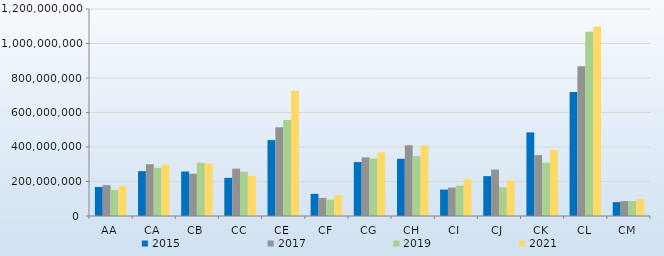
| Category | 2015 | 2017 | 2019 | 2021 |
|---|---|---|---|---|
| AA | 167978304 | 179261858 | 151408057 | 173776680 |
| CA | 260149386 | 299819346 | 279417683 | 297471659 |
| CB | 258106102 | 245004830 | 308661373 | 304556357 |
| CC | 221312980 | 274255013 | 256067782 | 233170064 |
| CE | 439972524 | 514952632 | 556244374 | 726088962 |
| CF | 128287479 | 105059626 | 94397767 | 121941328 |
| CG | 312556636 | 339794983 | 332197880 | 367599329 |
| CH | 331739276 | 409830676 | 347047080 | 409571777 |
| CI | 153154445 | 164477426 | 175543649 | 213469094 |
| CJ | 231160759 | 269125949 | 166321595 | 207429263 |
| CK | 484568969 | 353345374 | 309196108 | 383029050 |
| CL | 719332657 | 867893423 | 1067552852 | 1096917540 |
| CM | 80360387 | 86312311 | 86623583 | 98478331 |